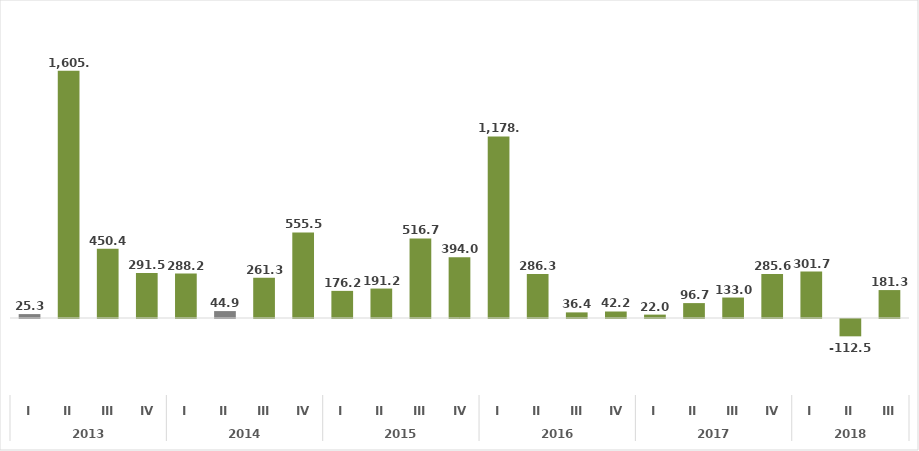
| Category | Series 0 |
|---|---|
| 0 | 25.349 |
| 1 | 1605.583 |
| 2 | 450.388 |
| 3 | 291.548 |
| 4 | 288.176 |
| 5 | 44.901 |
| 6 | 261.295 |
| 7 | 555.507 |
| 8 | 176.154 |
| 9 | 191.194 |
| 10 | 516.658 |
| 11 | 394.047 |
| 12 | 1178.66 |
| 13 | 286.252 |
| 14 | 36.441 |
| 15 | 42.213 |
| 16 | 21.975 |
| 17 | 96.742 |
| 18 | 132.971 |
| 19 | 285.598 |
| 20 | 301.718 |
| 21 | -112.518 |
| 22 | 181.344 |